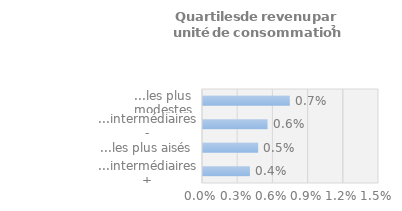
| Category | Series 0 |
|---|---|
| ...intermédiaires + | 0.004 |
| ...les plus aisés | 0.005 |
| ...intermédiaires - | 0.006 |
| ...les plus modestes | 0.007 |